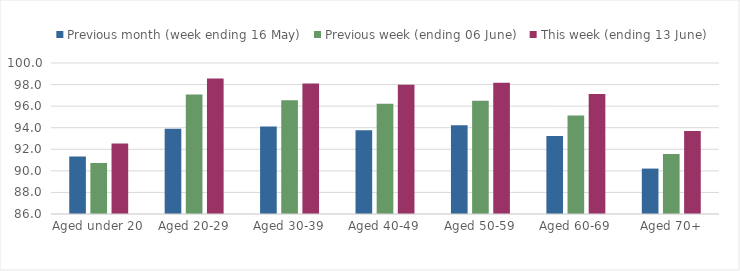
| Category | Previous month (week ending 16 May) | Previous week (ending 06 June) | This week (ending 13 June) |
|---|---|---|---|
| Aged under 20 | 91.334 | 90.731 | 92.546 |
| Aged 20-29 | 93.915 | 97.08 | 98.554 |
| Aged 30-39 | 94.111 | 96.536 | 98.088 |
| Aged 40-49 | 93.761 | 96.211 | 97.99 |
| Aged 50-59 | 94.23 | 96.503 | 98.163 |
| Aged 60-69 | 93.236 | 95.125 | 97.128 |
| Aged 70+ | 90.211 | 91.566 | 93.705 |